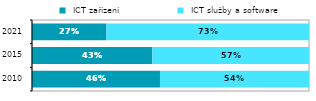
| Category |  ICT zařízení |  ICT služby a software |
|---|---|---|
| 2010.0 | 0.462 | 0.538 |
| 2015.0 | 0.435 | 0.565 |
| 2021.0 | 0.269 | 0.731 |